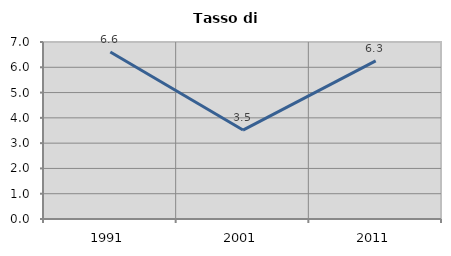
| Category | Tasso di disoccupazione   |
|---|---|
| 1991.0 | 6.604 |
| 2001.0 | 3.518 |
| 2011.0 | 6.254 |